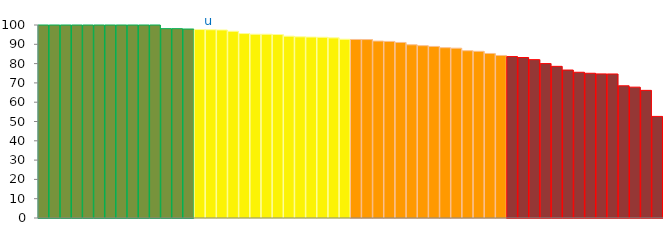
| Category | Top Quartile | 2nd Quartile | 3rd Quartile | Bottom Quartile | Series 4 |
|---|---|---|---|---|---|
|  | 100 | 0 | 0 | 0 | 100 |
|  | 100 | 0 | 0 | 0 | 100 |
|  | 100 | 0 | 0 | 0 | 100 |
|  | 100 | 0 | 0 | 0 | 100 |
|  | 100 | 0 | 0 | 0 | 100 |
|  | 100 | 0 | 0 | 0 | 100 |
|  | 100 | 0 | 0 | 0 | 100 |
|  | 100 | 0 | 0 | 0 | 100 |
|  | 100 | 0 | 0 | 0 | 100 |
|  | 100 | 0 | 0 | 0 | 100 |
|  | 100 | 0 | 0 | 0 | 100 |
|  | 98.113 | 0 | 0 | 0 | 98.113 |
|  | 98.101 | 0 | 0 | 0 | 98.101 |
|  | 97.917 | 0 | 0 | 0 | 97.917 |
|  | 0 | 97.647 | 0 | 0 | 97.647 |
| u | 0 | 97.541 | 0 | 0 | 97.541 |